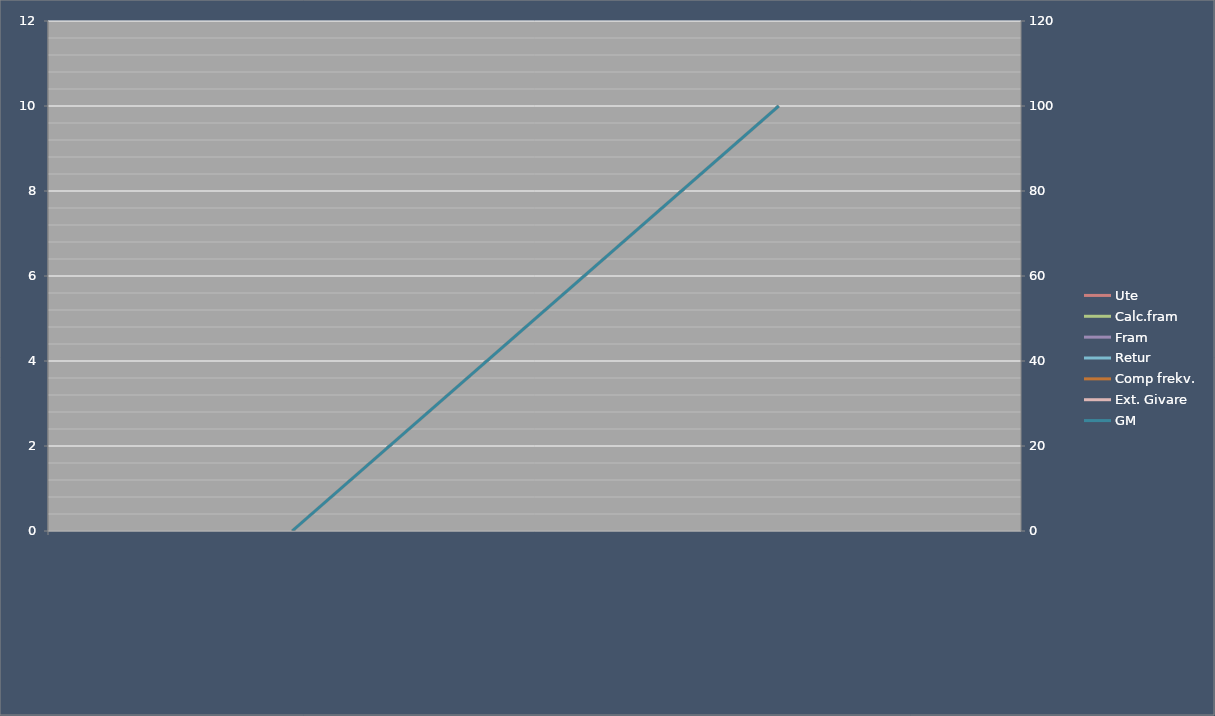
| Category | Ute | Calc.fram | Fram | Retur | Comp frekv. | Ext. Givare |
|---|---|---|---|---|---|---|
|  | 0 | 0 | 0 | 0 | 0 | 0 |
|  | 10 | 10 | 10 | 10 | 10 | 10 |